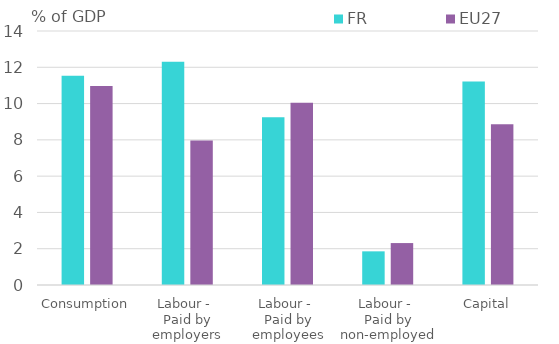
| Category | FR | EU27 |
|---|---|---|
| Consumption | 11.533 | 10.967 |
| Labour - 
Paid by employers | 12.306 | 7.966 |
| Labour - 
Paid by employees | 9.245 | 10.052 |
| Labour - 
Paid by non-employed | 1.855 | 2.311 |
| Capital | 11.213 | 8.858 |